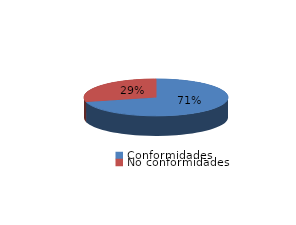
| Category | Series 0 |
|---|---|
| Conformidades | 185 |
| No conformidades | 76 |